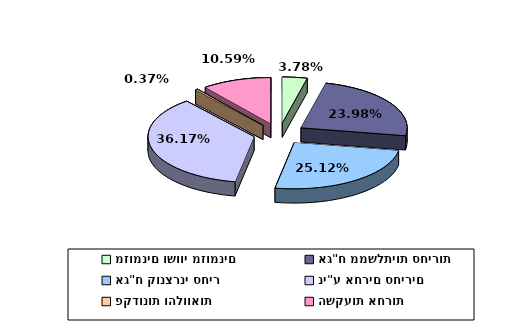
| Category | Series 0 |
|---|---|
| מזומנים ושווי מזומנים | 0.038 |
| אג"ח ממשלתיות סחירות | 0.24 |
| אג"ח קונצרני סחיר | 0.251 |
| ני"ע אחרים סחירים | 0.362 |
| פקדונות והלוואות | 0.004 |
| השקעות אחרות | 0.106 |